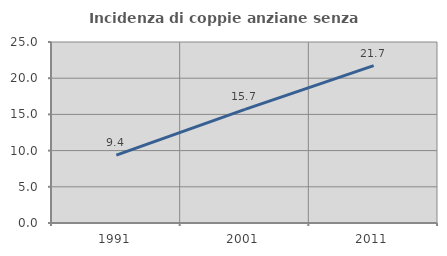
| Category | Incidenza di coppie anziane senza figli  |
|---|---|
| 1991.0 | 9.375 |
| 2001.0 | 15.686 |
| 2011.0 | 21.739 |